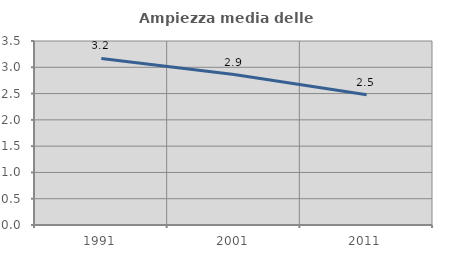
| Category | Ampiezza media delle famiglie |
|---|---|
| 1991.0 | 3.169 |
| 2001.0 | 2.861 |
| 2011.0 | 2.478 |